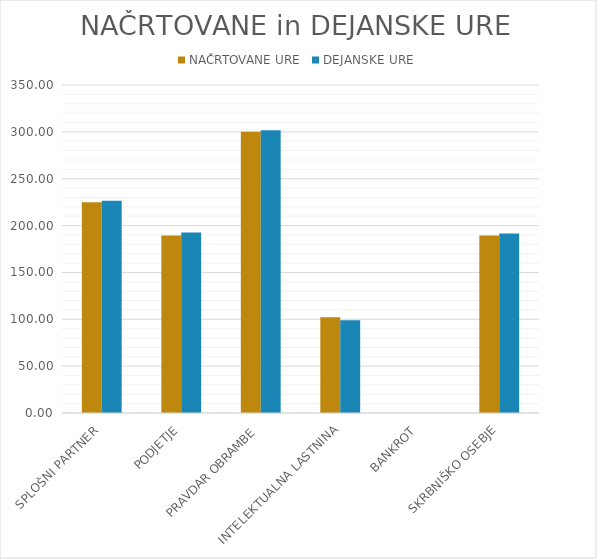
| Category | NAČRTOVANE URE | DEJANSKE URE |
|---|---|---|
| SPLOŠNI PARTNER | 225 | 226.5 |
| PODJETJE | 189.286 | 192.5 |
| PRAVDAR OBRAMBE | 300 | 301.714 |
| INTELEKTUALNA LASTNINA | 102.143 | 99 |
| BANKROT | 0 | 0 |
| SKRBNIŠKO OSEBJE | 189.286 | 191.429 |